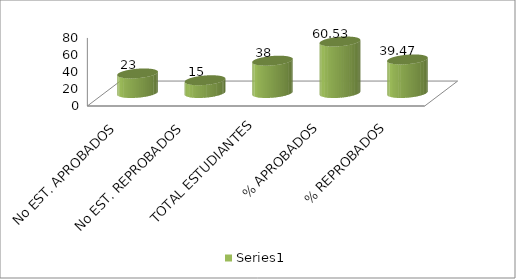
| Category | Series 0 |
|---|---|
| No EST. APROBADOS | 23 |
| No EST. REPROBADOS | 15 |
| TOTAL ESTUDIANTES | 38 |
| % APROBADOS | 60.526 |
| % REPROBADOS | 39.474 |